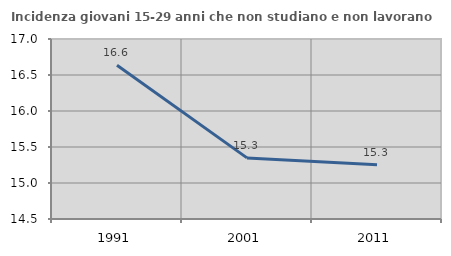
| Category | Incidenza giovani 15-29 anni che non studiano e non lavorano  |
|---|---|
| 1991.0 | 16.636 |
| 2001.0 | 15.349 |
| 2011.0 | 15.254 |